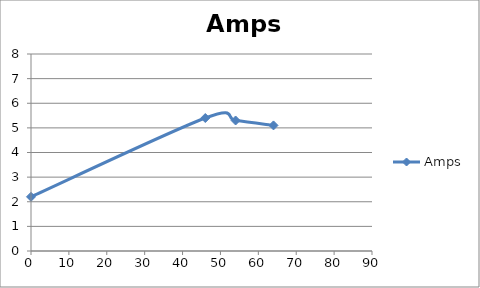
| Category | Amps |
|---|---|
| 0.0 | 2.2 |
| 46.0 | 5.4 |
| 54.0 | 5.3 |
| 64.0 | 5.1 |